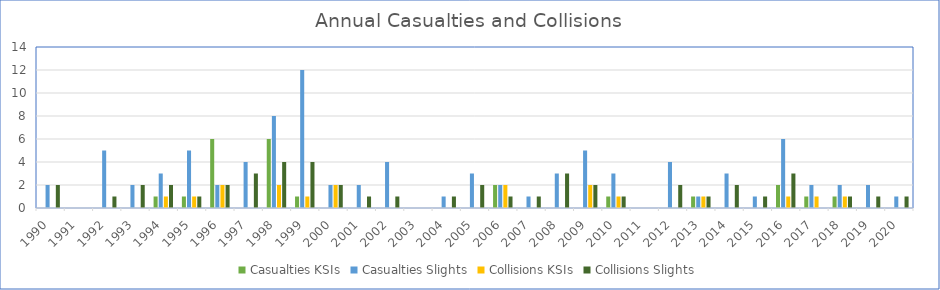
| Category | Casualties | Collisions |
|---|---|---|
| 1990.0 | 2 | 2 |
| 1991.0 | 0 | 0 |
| 1992.0 | 5 | 1 |
| 1993.0 | 2 | 2 |
| 1994.0 | 3 | 2 |
| 1995.0 | 5 | 1 |
| 1996.0 | 2 | 2 |
| 1997.0 | 4 | 3 |
| 1998.0 | 8 | 4 |
| 1999.0 | 12 | 4 |
| 2000.0 | 2 | 2 |
| 2001.0 | 2 | 1 |
| 2002.0 | 4 | 1 |
| 2003.0 | 0 | 0 |
| 2004.0 | 1 | 1 |
| 2005.0 | 3 | 2 |
| 2006.0 | 2 | 1 |
| 2007.0 | 1 | 1 |
| 2008.0 | 3 | 3 |
| 2009.0 | 5 | 2 |
| 2010.0 | 3 | 1 |
| 2011.0 | 0 | 0 |
| 2012.0 | 4 | 2 |
| 2013.0 | 1 | 1 |
| 2014.0 | 3 | 2 |
| 2015.0 | 1 | 1 |
| 2016.0 | 6 | 3 |
| 2017.0 | 2 | 0 |
| 2018.0 | 2 | 1 |
| 2019.0 | 2 | 1 |
| 2020.0 | 1 | 1 |